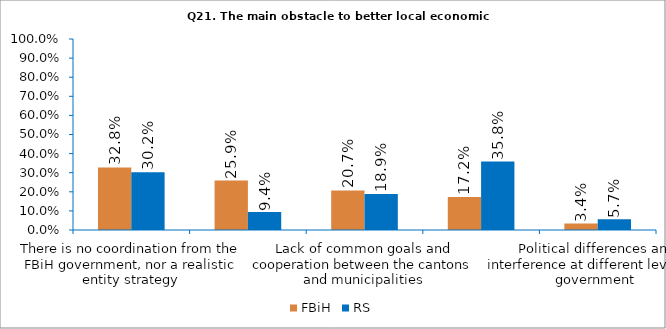
| Category | FBiH | RS |
|---|---|---|
| There is no coordination from the FBiH government, nor a realistic entity strategy | 0.328 | 0.302 |
| Insufficiently defined responsibilities of various levels of government | 0.259 | 0.094 |
| Lack of common goals and cooperation between the cantons and municipalities | 0.207 | 0.189 |
| Insufficient funding for legally assigned competencies | 0.172 | 0.358 |
| Political differences and interference at different levels of government  | 0.034 | 0.057 |